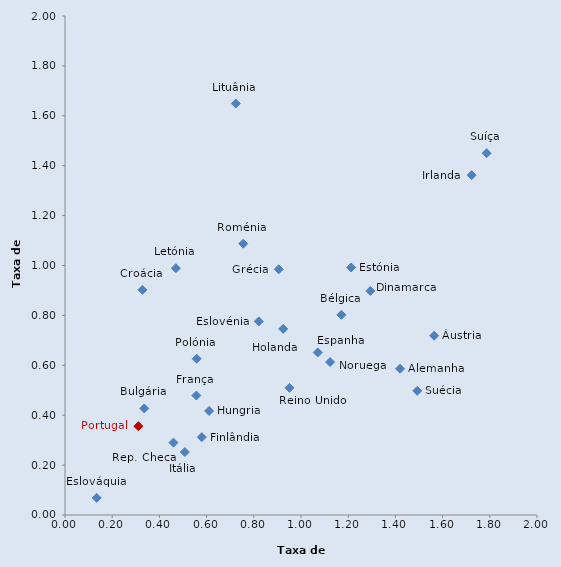
| Category | Series 0 |
|---|---|
| 1.5643138441082525 | 0.719 |
| 1.1711788141858386 | 0.802 |
| 0.3358259575136194 | 0.427 |
| 0.32810939016235063 | 0.902 |
| 0.4595127558268088 | 0.29 |
| 1.2938620514982266 | 0.898 |
| 1.212507750638612 | 0.992 |
| 0.5797954339226495 | 0.312 |
| 0.5564263630638747 | 0.479 |
| 1.4196347175582034 | 0.586 |
| 0.9057709699663612 | 0.985 |
| 0.6106170759171102 | 0.417 |
| 1.7230821798473899 | 1.362 |
| 0.5077384855534237 | 0.252 |
| 0.469757935801668 | 0.989 |
| 0.7237467953471374 | 1.649 |
| 1.0709095576799148 | 0.652 |
| 1.123255743600905 | 0.613 |
| 0.5579864045346407 | 0.626 |
| 0.31090329073696105 | 0.356 |
| 0.755260403853985 | 1.087 |
| 0.13431846231246636 | 0.068 |
| 0.8211101740251062 | 0.776 |
| 0.9245541354838707 | 0.746 |
| 1.4926711164013073 | 0.498 |
| 1.7863548297569734 | 1.45 |
| 0.9509825240270028 | 0.51 |